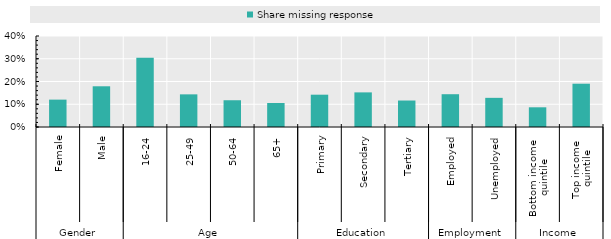
| Category | Share missing response |
|---|---|
| 0 | 0.12 |
| 1 | 0.179 |
| 2 | 0.305 |
| 3 | 0.144 |
| 4 | 0.118 |
| 5 | 0.105 |
| 6 | 0.142 |
| 7 | 0.152 |
| 8 | 0.116 |
| 9 | 0.144 |
| 10 | 0.128 |
| 11 | 0.087 |
| 12 | 0.19 |